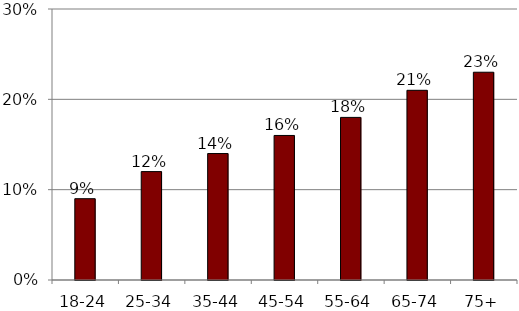
| Category | Percentage |
|---|---|
| 18-24 | 0.09 |
| 25-34 | 0.12 |
| 35-44 | 0.14 |
| 45-54 | 0.16 |
| 55-64 | 0.18 |
| 65-74 | 0.21 |
| 75+ | 0.23 |